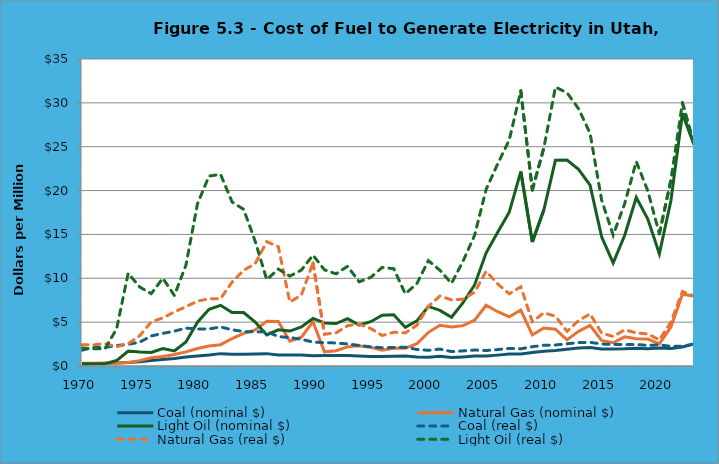
| Category | Coal (nominal $) | Natural Gas (nominal $) | Light Oil (nominal $) | Coal (real $) | Natural Gas (real $) | Light Oil (real $) |
|---|---|---|---|---|---|---|
| 1970.0 | 0.23 | 0.31 | 0.26 | 1.806 | 2.434 | 2.042 |
| 1971.0 | 0.28 | 0.32 | 0.26 | 2.107 | 2.408 | 1.956 |
| 1972.0 | 0.29 | 0.35 | 0.27 | 2.114 | 2.551 | 1.968 |
| 1973.0 | 0.34 | 0.32 | 0.62 | 2.333 | 2.196 | 4.255 |
| 1974.0 | 0.4 | 0.41 | 1.71 | 2.472 | 2.534 | 10.569 |
| 1975.0 | 0.48 | 0.61 | 1.59 | 2.719 | 3.455 | 9.005 |
| 1976.0 | 0.64 | 0.94 | 1.54 | 3.427 | 5.034 | 8.247 |
| 1977.0 | 0.74 | 1.09 | 1.99 | 3.721 | 5.481 | 10.006 |
| 1978.0 | 0.85 | 1.32 | 1.72 | 3.972 | 6.169 | 8.038 |
| 1979.0 | 1.03 | 1.61 | 2.74 | 4.323 | 6.757 | 11.5 |
| 1980.0 | 1.14 | 2 | 5 | 4.216 | 7.396 | 18.489 |
| 1981.0 | 1.26 | 2.29 | 6.46 | 4.224 | 7.676 | 21.654 |
| 1982.0 | 1.41 | 2.43 | 6.92 | 4.452 | 7.673 | 21.85 |
| 1983.0 | 1.35 | 3.13 | 6.11 | 4.13 | 9.575 | 18.692 |
| 1984.0 | 1.34 | 3.72 | 6.09 | 3.93 | 10.909 | 17.86 |
| 1985.0 | 1.37 | 4.12 | 5.02 | 3.88 | 11.667 | 14.216 |
| 1986.0 | 1.41 | 5.1 | 3.54 | 3.92 | 14.179 | 9.842 |
| 1987.0 | 1.25 | 5.07 | 4.12 | 3.353 | 13.599 | 11.051 |
| 1988.0 | 1.26 | 2.83 | 3.98 | 3.245 | 7.289 | 10.251 |
| 1989.0 | 1.24 | 3.29 | 4.45 | 3.047 | 8.084 | 10.935 |
| 1990.0 | 1.17 | 5.04 | 5.42 | 2.728 | 11.75 | 12.636 |
| 1991.0 | 1.19 | 1.62 | 4.9 | 2.662 | 3.624 | 10.962 |
| 1992.0 | 1.21 | 1.74 | 4.84 | 2.628 | 3.779 | 10.511 |
| 1993.0 | 1.19 | 2.18 | 5.39 | 2.509 | 4.597 | 11.366 |
| 1994.0 | 1.14 | 2.32 | 4.67 | 2.344 | 4.77 | 9.602 |
| 1995.0 | 1.09 | 2.14 | 5.05 | 2.179 | 4.279 | 10.097 |
| 1996.0 | 1.07 | 1.79 | 5.79 | 2.078 | 3.476 | 11.244 |
| 1997.0 | 1.11 | 2.03 | 5.84 | 2.107 | 3.854 | 11.087 |
| 1998.0 | 1.15 | 2.02 | 4.4 | 2.15 | 3.776 | 8.225 |
| 1999.0 | 1.03 | 2.54 | 5.14 | 1.884 | 4.646 | 9.401 |
| 2000.0 | 1.01 | 3.84 | 6.79 | 1.787 | 6.795 | 12.015 |
| 2001.0 | 1.12 | 4.64 | 6.34 | 1.927 | 7.983 | 10.908 |
| 2002.0 | 0.97 | 4.45 | 5.56 | 1.643 | 7.537 | 9.417 |
| 2003.0 | 1.04 | 4.6 | 7.22 | 1.722 | 7.618 | 11.956 |
| 2004.0 | 1.13 | 5.22 | 9.24 | 1.823 | 8.42 | 14.904 |
| 2005.0 | 1.13 | 6.92 | 12.91 | 1.763 | 10.796 | 20.142 |
| 2006.0 | 1.24 | 6.19 | 15.25 | 1.874 | 9.356 | 23.049 |
| 2007.0 | 1.36 | 5.6 | 17.53 | 1.999 | 8.231 | 25.767 |
| 2008.0 | 1.38 | 6.38 | 22.17 | 1.953 | 9.029 | 31.376 |
| 2009.0 | 1.55 | 3.56 | 14.13 | 2.201 | 5.056 | 20.068 |
| 2010.0 | 1.69 | 4.34 | 17.81 | 2.362 | 6.065 | 24.887 |
| 2011.0 | 1.77 | 4.19 | 23.47 | 2.398 | 5.676 | 31.792 |
| 2012.0 | 1.91 | 2.98 | 23.48 | 2.535 | 3.955 | 31.161 |
| 2013.0 | 2.04 | 3.95 | 22.43 | 2.668 | 5.166 | 29.338 |
| 2014.0 | 2.1 | 4.62 | 20.61 | 2.703 | 5.946 | 26.527 |
| 2015.0 | 1.95 | 2.92 | 14.72 | 2.507 | 3.754 | 18.924 |
| 2016.0 | 1.94 | 2.65 | 11.75 | 2.463 | 3.364 | 14.917 |
| 2017.0 | 1.96 | 3.32 | 14.9 | 2.436 | 4.127 | 18.522 |
| 2018.0 | 2.02 | 3.11 | 19.21 | 2.451 | 3.774 | 23.31 |
| 2019.0 | 1.97 | 3.07 | 16.75 | 2.348 | 3.659 | 19.963 |
| 2020.0 | 2.04 | 2.53 | 12.8 | 2.402 | 2.979 | 15.07 |
| 2021.0 | 1.99 | 4.45 | 18.84 | 2.238 | 5.004 | 21.185 |
| 2022.0 | 2.16 | 8.17 | 28.82 | 2.249 | 8.506 | 30.006 |
| 2023.0 | 2.51 | 7.98 | 25.27 | 2.51 | 7.98 | 25.27 |